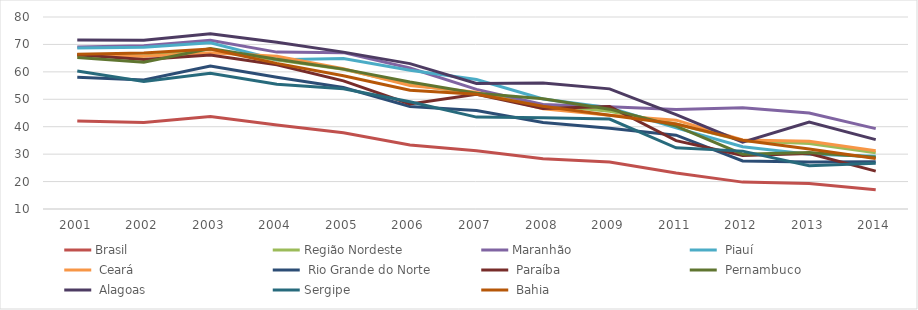
| Category | Brasil | Região Nordeste | Maranhão |  Piauí |  Ceará |  Rio Grande do Norte |  Paraíba |  Pernambuco |  Alagoas | Sergipe |  Bahia |
|---|---|---|---|---|---|---|---|---|---|---|---|
| 2001.0 | 42.1 | 66.2 | 69.1 | 68.7 | 65.8 | 58 | 66.2 | 65.2 | 71.6 | 60.3 | 66.4 |
| 2002.0 | 41.5 | 65.8 | 69.5 | 69 | 65.7 | 57 | 64.5 | 63.5 | 71.5 | 56.5 | 66.9 |
| 2003.0 | 43.7 | 68.2 | 71.5 | 70.6 | 67 | 62.1 | 66.1 | 68.5 | 73.9 | 59.5 | 68.3 |
| 2004.0 | 40.6 | 64.3 | 67.2 | 64.4 | 65.7 | 58 | 62.6 | 64.6 | 70.8 | 55.5 | 63.1 |
| 2005.0 | 37.8 | 60.9 | 67 | 64.9 | 61.1 | 54.3 | 56.7 | 61 | 67.2 | 53.8 | 58.6 |
| 2006.0 | 33.3 | 55.4 | 61.4 | 60.6 | 55 | 47.4 | 48.3 | 56.3 | 63 | 49.1 | 53.3 |
| 2007.0 | 31.2 | 52.1 | 53.6 | 57.2 | 52.6 | 45.9 | 51.8 | 52.2 | 55.8 | 43.5 | 51.8 |
| 2008.0 | 28.3 | 48 | 48.1 | 50.1 | 46.5 | 41.5 | 46.6 | 50.2 | 55.9 | 43.3 | 47.5 |
| 2009.0 | 27.1 | 45.6 | 47.3 | 46.9 | 44.2 | 39.4 | 47.4 | 46.4 | 53.8 | 42.8 | 44.2 |
| 2011.0 | 23.1 | 41 | 46.3 | 39.6 | 42.4 | 36.9 | 34.9 | 40.2 | 44.4 | 32.3 | 41 |
| 2012.0 | 19.8 | 34.9 | 46.9 | 32.7 | 35.2 | 27.5 | 29.5 | 30 | 34.4 | 31.1 | 35.1 |
| 2013.0 | 19.3 | 33.9 | 45 | 30 | 34.7 | 27.1 | 30.2 | 30.6 | 41.7 | 25.8 | 31.9 |
| 2014.0 | 17 | 30.5 | 39.3 | 29.2 | 31.2 | 27.2 | 23.8 | 28.9 | 35.3 | 26.7 | 28.4 |